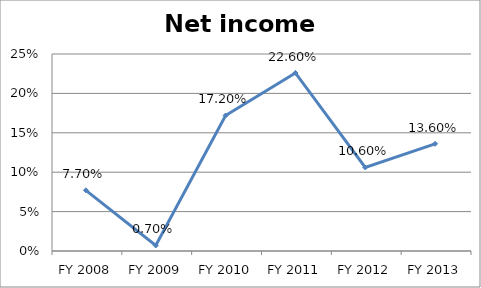
| Category | Net income ratio |
|---|---|
| FY 2013 | 0.136 |
| FY 2012 | 0.106 |
| FY 2011 | 0.226 |
| FY 2010 | 0.172 |
| FY 2009 | 0.007 |
| FY 2008 | 0.077 |